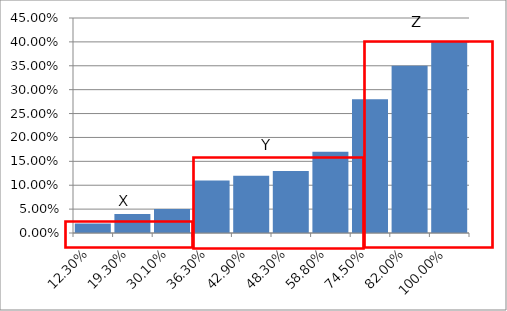
| Category | Series 0 |
|---|---|
| 0.12300000000000001 | 0.02 |
| 0.193 | 0.04 |
| 0.30100000000000005 | 0.05 |
| 0.36300000000000004 | 0.11 |
| 0.42900000000000005 | 0.12 |
| 0.48300000000000004 | 0.13 |
| 0.5880000000000001 | 0.17 |
| 0.7450000000000001 | 0.28 |
| 0.8200000000000001 | 0.35 |
| 1.0 | 0.4 |